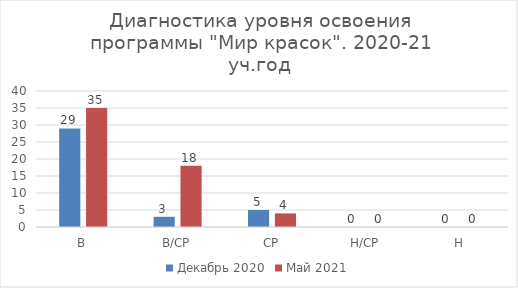
| Category | Декабрь 2020 | Май 2021 |
|---|---|---|
| В | 29 | 35 |
| В/СР | 3 | 18 |
| СР | 5 | 4 |
| Н/СР | 0 | 0 |
| Н | 0 | 0 |